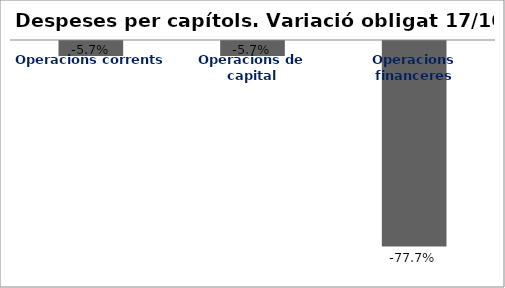
| Category | Series 0 |
|---|---|
| Operacions corrents | -0.057 |
| Operacions de capital | -0.057 |
| Operacions financeres | -0.777 |